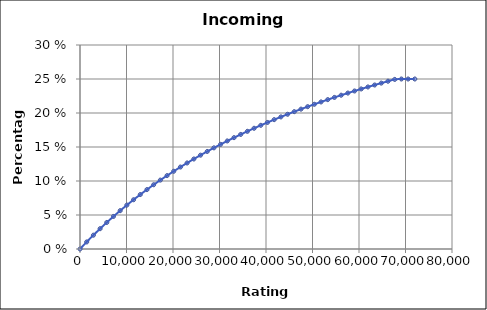
| Category | Incoming Healing |
|---|---|
| 0.0 | 0 |
| 1440.0 | 0.01 |
| 2880.0 | 0.02 |
| 4320.0 | 0.03 |
| 5760.0 | 0.039 |
| 7200.0 | 0.048 |
| 8640.0 | 0.056 |
| 10080.0 | 0.065 |
| 11520.0 | 0.072 |
| 12960.0 | 0.08 |
| 14400.0 | 0.087 |
| 15840.0 | 0.094 |
| 17280.0 | 0.101 |
| 18720.0 | 0.108 |
| 20160.0 | 0.114 |
| 21600.0 | 0.121 |
| 23040.0 | 0.127 |
| 24480.0 | 0.132 |
| 25920.0 | 0.138 |
| 27360.0 | 0.143 |
| 28800.0 | 0.149 |
| 30240.0 | 0.154 |
| 31680.0 | 0.159 |
| 33120.0 | 0.164 |
| 34560.0 | 0.168 |
| 36000.0 | 0.173 |
| 37440.0 | 0.178 |
| 38880.0 | 0.182 |
| 40320.0 | 0.186 |
| 41760.0 | 0.19 |
| 43200.0 | 0.194 |
| 44640.0 | 0.198 |
| 46080.0 | 0.202 |
| 47520.0 | 0.206 |
| 48960.0 | 0.209 |
| 50400.0 | 0.213 |
| 51840.0 | 0.216 |
| 53280.0 | 0.22 |
| 54720.0 | 0.223 |
| 56160.0 | 0.226 |
| 57600.0 | 0.229 |
| 59040.0 | 0.232 |
| 60480.0 | 0.235 |
| 61920.0 | 0.238 |
| 63360.0 | 0.241 |
| 64800.0 | 0.244 |
| 66240.0 | 0.247 |
| 67680.0 | 0.249 |
| 69120.0 | 0.25 |
| 70560.0 | 0.25 |
| 72000.0 | 0.25 |